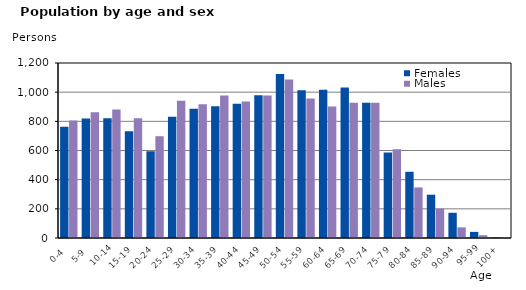
| Category | Females | Males |
|---|---|---|
|   0-4  | 763 | 806 |
|   5-9  | 819 | 862 |
| 10-14 | 821 | 882 |
| 15-19  | 732 | 821 |
| 20-24  | 595 | 698 |
| 25-29  | 832 | 942 |
| 30-34  | 886 | 918 |
| 35-39  | 903 | 978 |
| 40-44  | 920 | 936 |
| 45-49  | 979 | 977 |
| 50-54  | 1125 | 1087 |
| 55-59  | 1013 | 957 |
| 60-64  | 1016 | 901 |
| 65-69  | 1032 | 928 |
| 70-74  | 927 | 928 |
| 75-79  | 586 | 608 |
| 80-84  | 454 | 347 |
| 85-89  | 297 | 201 |
| 90-94  | 173 | 73 |
| 95-99 | 42 | 19 |
| 100+ | 4 | 1 |